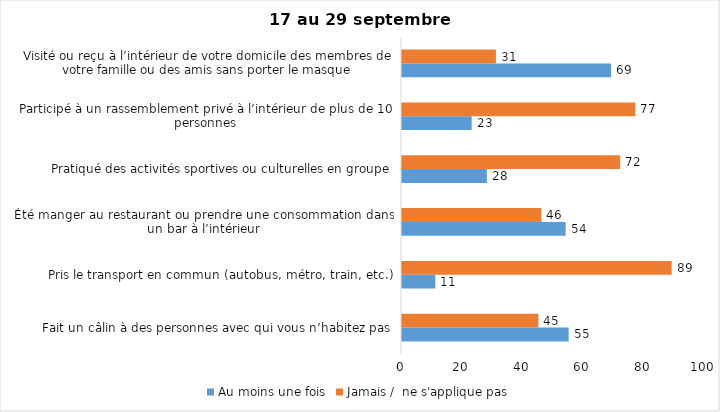
| Category | Au moins une fois | Jamais /  ne s'applique pas |
|---|---|---|
| Fait un câlin à des personnes avec qui vous n’habitez pas | 55 | 45 |
| Pris le transport en commun (autobus, métro, train, etc.) | 11 | 89 |
| Été manger au restaurant ou prendre une consommation dans un bar à l’intérieur | 54 | 46 |
| Pratiqué des activités sportives ou culturelles en groupe | 28 | 72 |
| Participé à un rassemblement privé à l’intérieur de plus de 10 personnes | 23 | 77 |
| Visité ou reçu à l’intérieur de votre domicile des membres de votre famille ou des amis sans porter le masque | 69 | 31 |